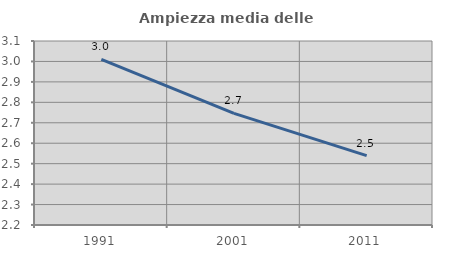
| Category | Ampiezza media delle famiglie |
|---|---|
| 1991.0 | 3.01 |
| 2001.0 | 2.746 |
| 2011.0 | 2.54 |